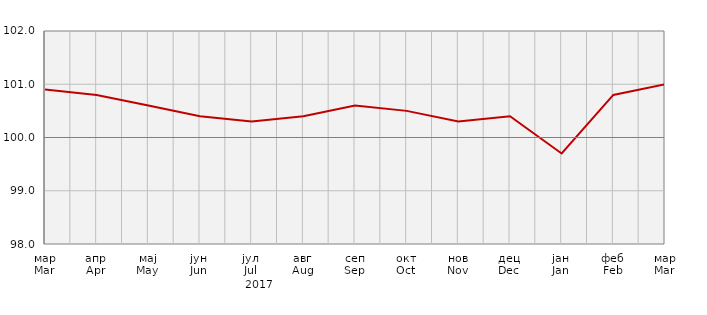
| Category | Индекси потрошачких цијена
Consumer price indices |
|---|---|
| мар
Mar | 100.9 |
| апр
Apr | 100.8 |
| мај
May | 100.6 |
| јун
Jun | 100.4 |
| јул
Jul | 100.3 |
| авг
Aug | 100.4 |
| сеп
Sep | 100.6 |
| окт
Oct | 100.5 |
| нов
Nov | 100.3 |
| дец
Dec | 100.4 |
| јан
Jan | 99.7 |
| феб
Feb | 100.8 |
| мар
Mar | 101 |